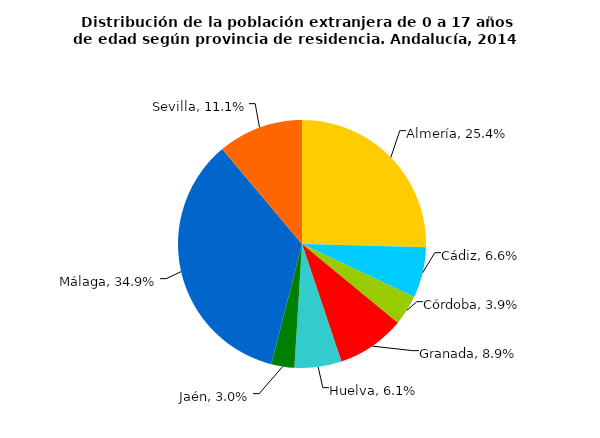
| Category | Series 0 |
|---|---|
| Almería | 0.254 |
| Cádiz | 0.066 |
| Córdoba | 0.039 |
| Granada | 0.089 |
| Huelva | 0.061 |
| Jaén | 0.03 |
| Málaga | 0.349 |
| Sevilla | 0.111 |